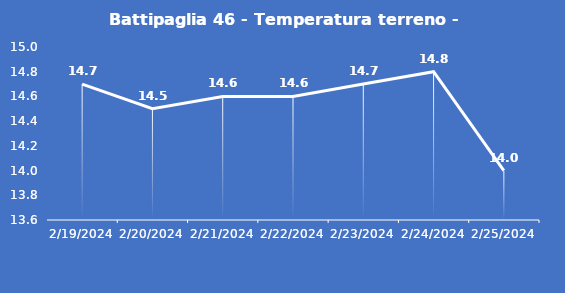
| Category | Battipaglia 46 - Temperatura terreno - Max (°C) |
|---|---|
| 2/19/24 | 14.7 |
| 2/20/24 | 14.5 |
| 2/21/24 | 14.6 |
| 2/22/24 | 14.6 |
| 2/23/24 | 14.7 |
| 2/24/24 | 14.8 |
| 2/25/24 | 14 |